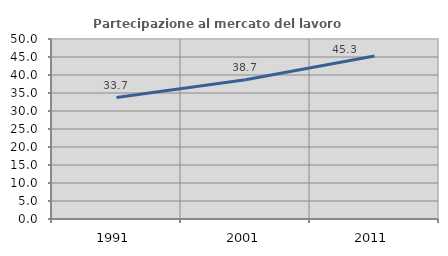
| Category | Partecipazione al mercato del lavoro  femminile |
|---|---|
| 1991.0 | 33.734 |
| 2001.0 | 38.665 |
| 2011.0 | 45.27 |